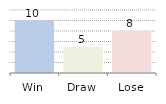
| Category | Series 0 |
|---|---|
| Win | 10 |
| Draw | 5 |
| Lose | 8 |